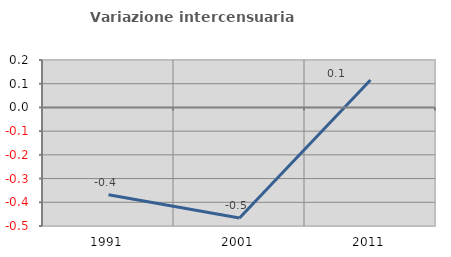
| Category | Variazione intercensuaria annua |
|---|---|
| 1991.0 | -0.368 |
| 2001.0 | -0.466 |
| 2011.0 | 0.115 |